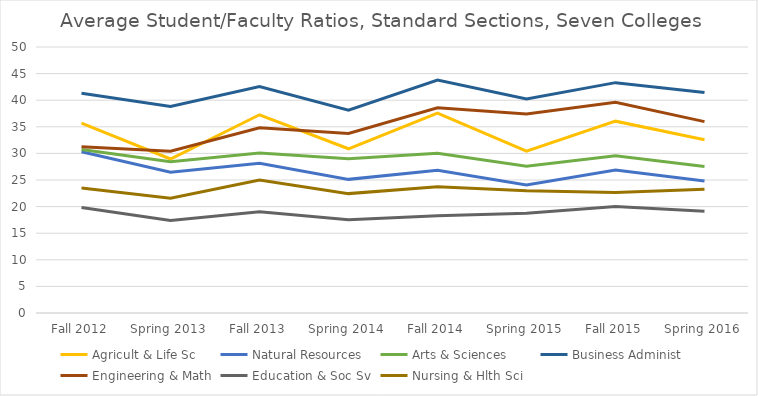
| Category | Agricult & Life Sc | Natural Resources | Arts & Sciences | Business Administ | Engineering & Math | Education & Soc Sv | Nursing & Hlth Sci |
|---|---|---|---|---|---|---|---|
| Fall 2012 | 35.68 | 30.3 | 30.72 | 41.32 | 31.25 | 19.83 | 23.51 |
| Spring 2013 | 28.95 | 26.47 | 28.43 | 38.8 | 30.41 | 17.4 | 21.56 |
| Fall 2013 | 37.26 | 28.15 | 30.09 | 42.57 | 34.8 | 19.04 | 24.98 |
| Spring 2014 | 30.87 | 25.12 | 29 | 38.12 | 33.76 | 17.51 | 22.44 |
| Fall 2014 | 37.59 | 26.81 | 30.01 | 43.77 | 38.59 | 18.28 | 23.73 |
| Spring 2015 | 30.43 | 24.08 | 27.6 | 40.22 | 37.42 | 18.74 | 22.99 |
| Fall 2015 | 36.06 | 26.86 | 29.54 | 43.3 | 39.6 | 20.04 | 22.63 |
| Spring 2016 | 32.56 | 24.8 | 27.53 | 41.45 | 35.97 | 19.13 | 23.24 |